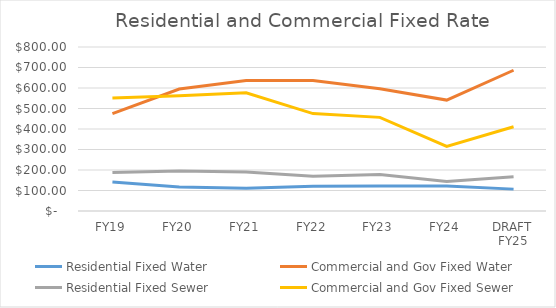
| Category | Residential Fixed Water | Commercial and Gov Fixed Water | Residential Fixed Sewer | Commercial and Gov Fixed Sewer |
|---|---|---|---|---|
| FY19 | 141.2 | 475.04 | 187.28 | 551.49 |
| FY20 | 116.517 | 594.717 | 194.637 | 562.561 |
| FY21 | 111.329 | 636.57 | 190.661 | 577.076 |
| FY22 | 120.447 | 636.618 | 169.72 | 475.045 |
| FY23 | 122.065 | 596.068 | 177.462 | 456.697 |
| FY24 | 121.869 | 541.026 | 144.338 | 315 |
| DRAFT FY25 | 106.71 | 686.58 | 166.56 | 411.17 |